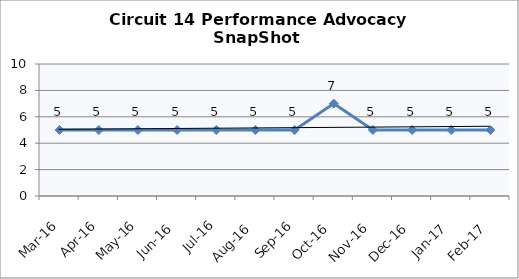
| Category | Circuit 14 |
|---|---|
| Mar-16 | 5 |
| Apr-16 | 5 |
| May-16 | 5 |
| Jun-16 | 5 |
| Jul-16 | 5 |
| Aug-16 | 5 |
| Sep-16 | 5 |
| Oct-16 | 7 |
| Nov-16 | 5 |
| Dec-16 | 5 |
| Jan-17 | 5 |
| Feb-17 | 5 |